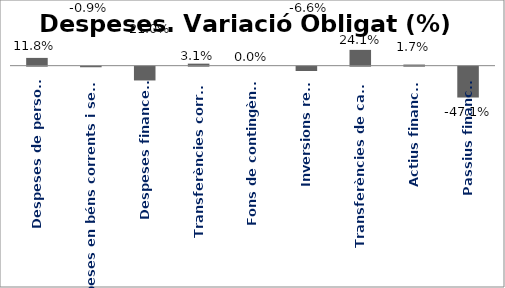
| Category | Series 0 |
|---|---|
| Despeses de personal | 0.118 |
| Despeses en béns corrents i serveis | -0.009 |
| Despeses financeres | -0.21 |
| Transferències corrents | 0.031 |
| Fons de contingència | 0 |
| Inversions reals | -0.066 |
| Transferències de capital | 0.241 |
| Actius financers | 0.017 |
| Passius financers | -0.471 |